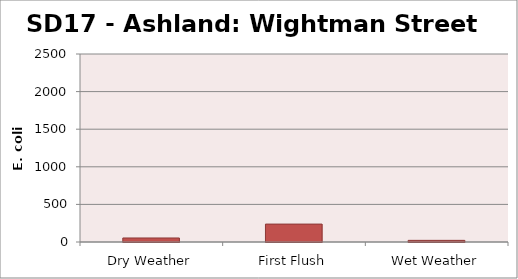
| Category | E. coli MPN |
|---|---|
| Dry Weather | 53.6 |
| First Flush | 238.2 |
| Wet Weather | 21.8 |